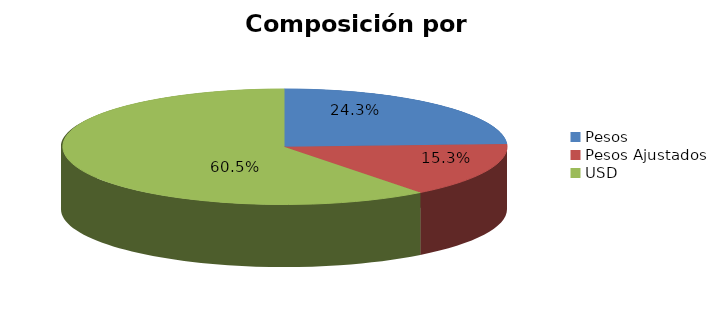
| Category | % | Millones ARS |
|---|---|---|
| Pesos | 0.243 | 17007.79 |
| Pesos Ajustados | 0.153 | 10711.081 |
| USD | 0.605 | 42388.801 |